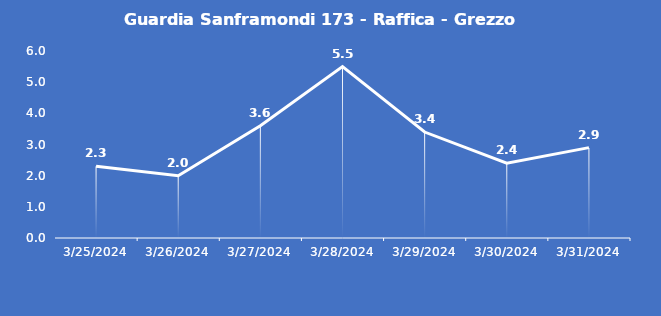
| Category | Guardia Sanframondi 173 - Raffica - Grezzo (m/s) |
|---|---|
| 3/25/24 | 2.3 |
| 3/26/24 | 2 |
| 3/27/24 | 3.6 |
| 3/28/24 | 5.5 |
| 3/29/24 | 3.4 |
| 3/30/24 | 2.4 |
| 3/31/24 | 2.9 |